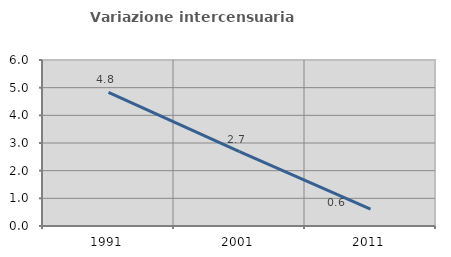
| Category | Variazione intercensuaria annua |
|---|---|
| 1991.0 | 4.832 |
| 2001.0 | 2.685 |
| 2011.0 | 0.608 |